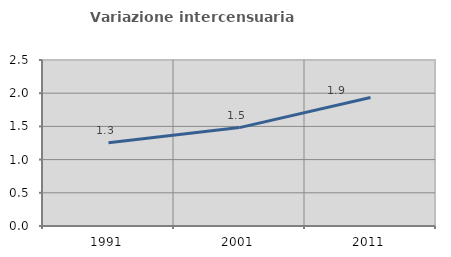
| Category | Variazione intercensuaria annua |
|---|---|
| 1991.0 | 1.254 |
| 2001.0 | 1.482 |
| 2011.0 | 1.936 |